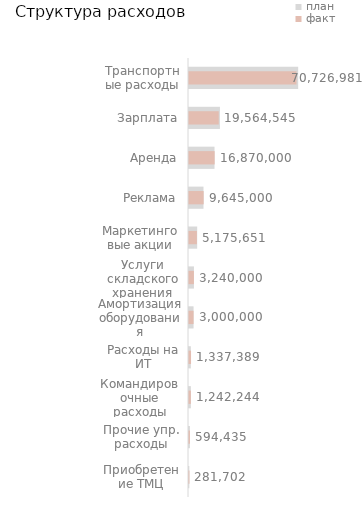
| Category | план |
|---|---|
| Приобретение ТМЦ | 217642 |
| Прочие упр. расходы | 582314 |
| Командировочные расходы | 1216003 |
| Расходы на ИТ | 1208088 |
| Амортизация оборудования | 3000000 |
| Услуги складского хранения | 3240000 |
| Маркетинговые акции | 5397622.836 |
| Реклама | 9523000 |
| Аренда | 16800000 |
| Зарплата | 20356050 |
| Транспортные расходы | 71843504.069 |